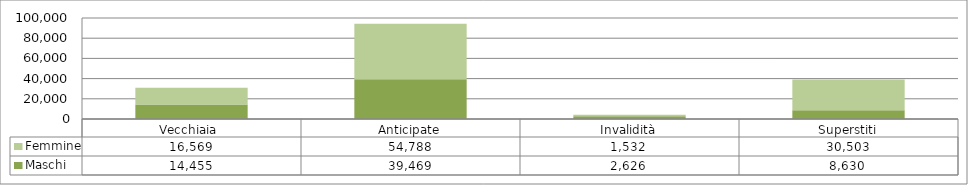
| Category | Maschi | Femmine |
|---|---|---|
| Vecchiaia  | 14455 | 16569 |
| Anticipate | 39469 | 54788 |
| Invalidità | 2626 | 1532 |
| Superstiti | 8630 | 30503 |